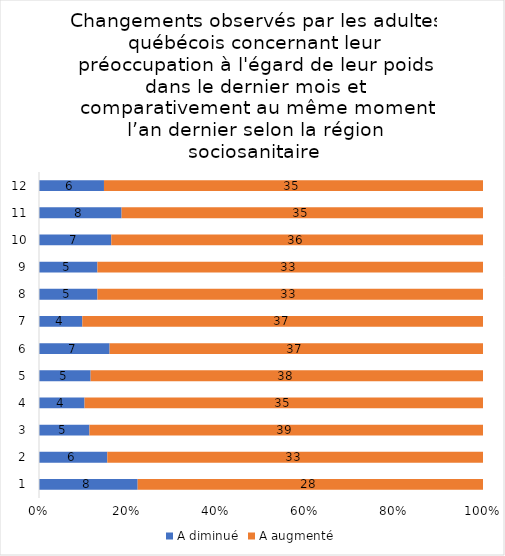
| Category | A diminué | A augmenté |
|---|---|---|
| 0 | 8 | 28 |
| 1 | 6 | 33 |
| 2 | 5 | 39 |
| 3 | 4 | 35 |
| 4 | 5 | 38 |
| 5 | 7 | 37 |
| 6 | 4 | 37 |
| 7 | 5 | 33 |
| 8 | 5 | 33 |
| 9 | 7 | 36 |
| 10 | 8 | 35 |
| 11 | 6 | 35 |